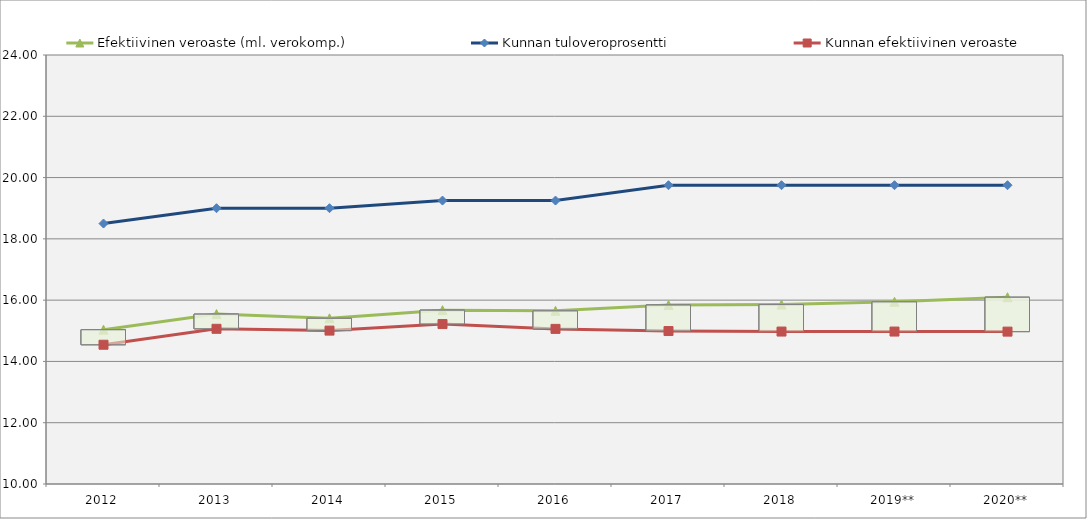
| Category | Efektiivinen veroaste (ml. verokomp.) | Kunnan tuloveroprosentti | Kunnan efektiivinen veroaste |
|---|---|---|---|
| 2012 | 15.036 | 18.5 | 14.545 |
| 2013 | 15.544 | 19 | 15.064 |
| 2014 | 15.406 | 19 | 15.006 |
| 2015 | 15.674 | 19.25 | 15.22 |
| 2016 | 15.651 | 19.25 | 15.062 |
| 2017 | 15.842 | 19.75 | 14.992 |
| 2018 | 15.855 | 19.75 | 14.975 |
| 2019** | 15.946 | 19.75 | 14.975 |
| 2020** | 16.096 | 19.75 | 14.973 |